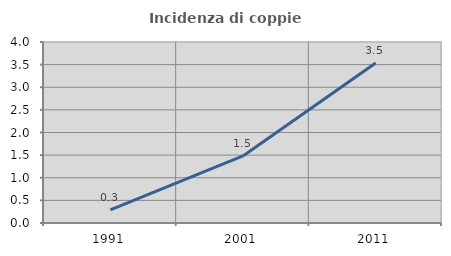
| Category | Incidenza di coppie miste |
|---|---|
| 1991.0 | 0.29 |
| 2001.0 | 1.483 |
| 2011.0 | 3.535 |